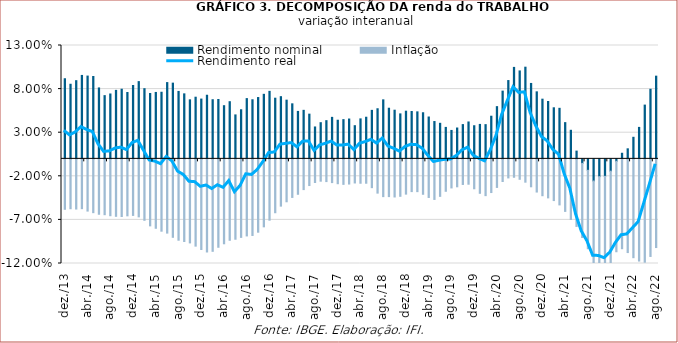
| Category | Rendimento nominal | Inflação |
|---|---|---|
| 2013-12-01 | 0.092 | -0.058 |
| 2014-01-01 | 0.086 | -0.057 |
| 2014-02-01 | 0.09 | -0.058 |
| 2014-03-01 | 0.096 | -0.057 |
| 2014-04-01 | 0.095 | -0.06 |
| 2014-05-01 | 0.094 | -0.062 |
| 2014-06-01 | 0.081 | -0.064 |
| 2014-07-01 | 0.073 | -0.064 |
| 2014-08-01 | 0.074 | -0.065 |
| 2014-09-01 | 0.079 | -0.066 |
| 2014-10-01 | 0.08 | -0.066 |
| 2014-11-01 | 0.076 | -0.065 |
| 2014-12-01 | 0.084 | -0.065 |
| 2015-01-01 | 0.089 | -0.067 |
| 2015-02-01 | 0.08 | -0.07 |
| 2015-03-01 | 0.075 | -0.077 |
| 2015-04-01 | 0.076 | -0.08 |
| 2015-05-01 | 0.076 | -0.083 |
| 2015-06-01 | 0.087 | -0.085 |
| 2015-07-01 | 0.087 | -0.09 |
| 2015-08-01 | 0.077 | -0.093 |
| 2015-09-01 | 0.075 | -0.095 |
| 2015-10-01 | 0.068 | -0.096 |
| 2015-11-01 | 0.071 | -0.1 |
| 2015-12-01 | 0.069 | -0.104 |
| 2016-01-01 | 0.073 | -0.107 |
| 2016-02-01 | 0.068 | -0.106 |
| 2016-03-01 | 0.068 | -0.101 |
| 2016-04-01 | 0.061 | -0.097 |
| 2016-05-01 | 0.066 | -0.093 |
| 2016-06-01 | 0.05 | -0.092 |
| 2016-07-01 | 0.056 | -0.09 |
| 2016-08-01 | 0.069 | -0.088 |
| 2016-09-01 | 0.068 | -0.088 |
| 2016-10-01 | 0.07 | -0.084 |
| 2016-11-01 | 0.074 | -0.078 |
| 2016-12-01 | 0.077 | -0.07 |
| 2017-01-01 | 0.07 | -0.062 |
| 2017-02-01 | 0.071 | -0.054 |
| 2017-03-01 | 0.067 | -0.049 |
| 2017-04-01 | 0.063 | -0.044 |
| 2017-05-01 | 0.054 | -0.041 |
| 2017-06-01 | 0.056 | -0.035 |
| 2017-07-01 | 0.051 | -0.031 |
| 2017-08-01 | 0.037 | -0.027 |
| 2017-09-01 | 0.041 | -0.026 |
| 2017-10-01 | 0.044 | -0.026 |
| 2017-11-01 | 0.048 | -0.027 |
| 2017-12-01 | 0.044 | -0.029 |
| 2018-01-01 | 0.045 | -0.029 |
| 2018-02-01 | 0.046 | -0.029 |
| 2018-03-01 | 0.038 | -0.028 |
| 2018-04-01 | 0.046 | -0.028 |
| 2018-05-01 | 0.048 | -0.028 |
| 2018-06-01 | 0.056 | -0.033 |
| 2018-07-01 | 0.057 | -0.039 |
| 2018-08-01 | 0.068 | -0.043 |
| 2018-09-01 | 0.058 | -0.043 |
| 2018-10-01 | 0.056 | -0.044 |
| 2018-11-01 | 0.052 | -0.043 |
| 2018-12-01 | 0.055 | -0.04 |
| 2019-01-01 | 0.054 | -0.038 |
| 2019-02-01 | 0.054 | -0.038 |
| 2019-03-01 | 0.053 | -0.041 |
| 2019-04-01 | 0.048 | -0.044 |
| 2019-05-01 | 0.043 | -0.047 |
| 2019-06-01 | 0.041 | -0.043 |
| 2019-07-01 | 0.036 | -0.037 |
| 2019-08-01 | 0.033 | -0.033 |
| 2019-09-01 | 0.035 | -0.032 |
| 2019-10-01 | 0.039 | -0.029 |
| 2019-11-01 | 0.042 | -0.029 |
| 2019-12-01 | 0.038 | -0.034 |
| 2020-01-01 | 0.04 | -0.04 |
| 2020-02-01 | 0.039 | -0.042 |
| 2020-03-01 | 0.049 | -0.039 |
| 2020-04-01 | 0.06 | -0.033 |
| 2020-05-01 | 0.078 | -0.026 |
| 2020-06-01 | 0.09 | -0.022 |
| 2020-07-01 | 0.105 | -0.021 |
| 2020-08-01 | 0.101 | -0.023 |
| 2020-09-01 | 0.105 | -0.027 |
| 2020-10-01 | 0.086 | -0.032 |
| 2020-11-01 | 0.077 | -0.038 |
| 2020-12-01 | 0.068 | -0.042 |
| 2021-01-01 | 0.066 | -0.045 |
| 2021-02-01 | 0.059 | -0.048 |
| 2021-03-01 | 0.058 | -0.053 |
| 2021-04-01 | 0.042 | -0.06 |
| 2021-05-01 | 0.033 | -0.07 |
| 2021-06-01 | 0.009 | -0.077 |
| 2021-07-01 | -0.005 | -0.085 |
| 2021-08-01 | -0.013 | -0.09 |
| 2021-09-01 | -0.025 | -0.096 |
| 2021-10-01 | -0.02 | -0.102 |
| 2021-11-01 | -0.02 | -0.106 |
| 2021-12-01 | -0.014 | -0.105 |
| 2022-01-01 | -0.003 | -0.104 |
| 2022-02-01 | 0.006 | -0.103 |
| 2022-03-01 | 0.012 | -0.107 |
| 2022-04-01 | 0.025 | -0.113 |
| 2022-05-01 | 0.036 | -0.117 |
| 2022-06-01 | 0.062 | -0.118 |
| 2022-07-01 | 0.08 | -0.112 |
| 2022-08-01 | 0.095 | -0.102 |